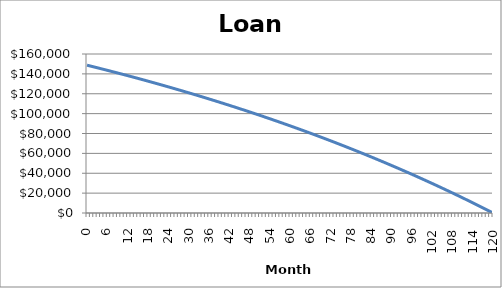
| Category | Series 0 |
|---|---|
| 0.0 | 148732.96 |
| 1.0 | 147887.75 |
| 2.0 | 147037.4 |
| 3.0 | 146181.88 |
| 4.0 | 145321.15 |
| 5.0 | 144455.19 |
| 6.0 | 143583.96 |
| 7.0 | 142707.43 |
| 8.0 | 141825.57 |
| 9.0 | 140938.34 |
| 10.0 | 140045.71 |
| 11.0 | 139147.65 |
| 12.0 | 138244.13 |
| 13.0 | 137335.12 |
| 14.0 | 136420.58 |
| 15.0 | 135500.47 |
| 16.0 | 134574.76 |
| 17.0 | 133643.42 |
| 18.0 | 132706.42 |
| 19.0 | 131763.72 |
| 20.0 | 130815.28 |
| 21.0 | 129861.07 |
| 22.0 | 128901.06 |
| 23.0 | 127935.21 |
| 24.0 | 126963.48 |
| 25.0 | 125985.84 |
| 26.0 | 125002.25 |
| 27.0 | 124012.68 |
| 28.0 | 123017.09 |
| 29.0 | 122015.44 |
| 30.0 | 121007.7 |
| 31.0 | 119993.83 |
| 32.0 | 118973.79 |
| 33.0 | 117947.55 |
| 34.0 | 116915.06 |
| 35.0 | 115876.29 |
| 36.0 | 114831.2 |
| 37.0 | 113779.76 |
| 38.0 | 112721.92 |
| 39.0 | 111657.65 |
| 40.0 | 110586.9 |
| 41.0 | 109509.64 |
| 42.0 | 108425.82 |
| 43.0 | 107335.41 |
| 44.0 | 106238.37 |
| 45.0 | 105134.65 |
| 46.0 | 104024.22 |
| 47.0 | 102907.03 |
| 48.0 | 101783.05 |
| 49.0 | 100652.23 |
| 50.0 | 99514.53 |
| 51.0 | 98369.91 |
| 52.0 | 97218.33 |
| 53.0 | 96059.74 |
| 54.0 | 94894.1 |
| 55.0 | 93721.37 |
| 56.0 | 92541.51 |
| 57.0 | 91354.47 |
| 58.0 | 90160.21 |
| 59.0 | 88958.68 |
| 60.0 | 87749.85 |
| 61.0 | 86533.66 |
| 62.0 | 85310.07 |
| 63.0 | 84079.04 |
| 64.0 | 82840.52 |
| 65.0 | 81594.47 |
| 66.0 | 80340.84 |
| 67.0 | 79079.58 |
| 68.0 | 77810.65 |
| 69.0 | 76534 |
| 70.0 | 75249.58 |
| 71.0 | 73957.35 |
| 72.0 | 72657.26 |
| 73.0 | 71349.26 |
| 74.0 | 70033.3 |
| 75.0 | 68709.34 |
| 76.0 | 67377.32 |
| 77.0 | 66037.2 |
| 78.0 | 64688.93 |
| 79.0 | 63332.45 |
| 80.0 | 61967.72 |
| 81.0 | 60594.69 |
| 82.0 | 59213.31 |
| 83.0 | 57823.52 |
| 84.0 | 56425.28 |
| 85.0 | 55018.53 |
| 86.0 | 53603.23 |
| 87.0 | 52179.32 |
| 88.0 | 50746.74 |
| 89.0 | 49305.45 |
| 90.0 | 47855.39 |
| 91.0 | 46396.51 |
| 92.0 | 44928.76 |
| 93.0 | 43452.08 |
| 94.0 | 41966.41 |
| 95.0 | 40471.71 |
| 96.0 | 38967.91 |
| 97.0 | 37454.96 |
| 98.0 | 35932.81 |
| 99.0 | 34401.4 |
| 100.0 | 32860.68 |
| 101.0 | 31310.58 |
| 102.0 | 29751.05 |
| 103.0 | 28182.04 |
| 104.0 | 26603.48 |
| 105.0 | 25015.32 |
| 106.0 | 23417.5 |
| 107.0 | 21809.96 |
| 108.0 | 20192.64 |
| 109.0 | 18565.48 |
| 110.0 | 16928.42 |
| 111.0 | 15281.4 |
| 112.0 | 13624.36 |
| 113.0 | 11957.24 |
| 114.0 | 10279.98 |
| 115.0 | 8592.52 |
| 116.0 | 6894.79 |
| 117.0 | 5186.73 |
| 118.0 | 3468.28 |
| 119.0 | 1739.38 |
| 120.0 | 0 |